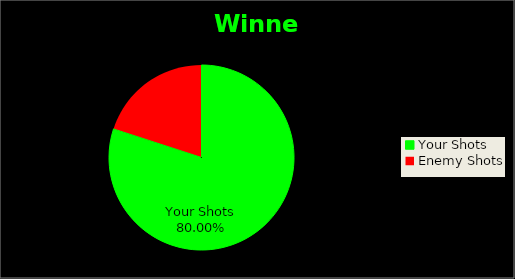
| Category | Winner |
|---|---|
| Your Shots | 0.8 |
| Enemy Shots | 0.2 |